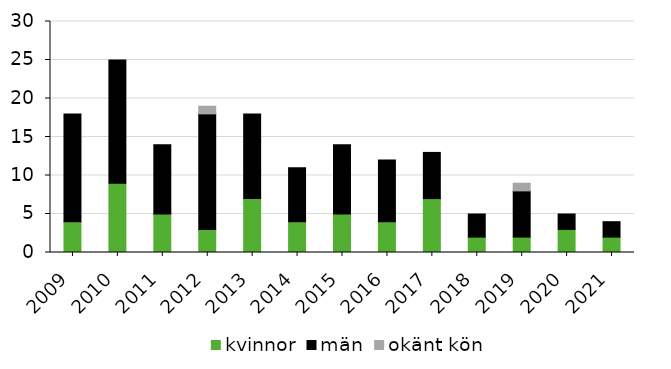
| Category | kvinnor | män | okänt kön |
|---|---|---|---|
| 2009 | 4 | 14 | 0 |
| 2010 | 9 | 16 | 0 |
| 2011 | 5 | 9 | 0 |
| 2012 | 3 | 15 | 1 |
| 2013 | 7 | 11 | 0 |
| 2014 | 4 | 7 | 0 |
| 2015 | 5 | 9 | 0 |
| 2016 | 4 | 8 | 0 |
| 2017 | 7 | 6 | 0 |
| 2018 | 2 | 3 | 0 |
| 2019 | 2 | 6 | 1 |
| 2020 | 3 | 2 | 0 |
| 2021 | 2 | 2 | 0 |